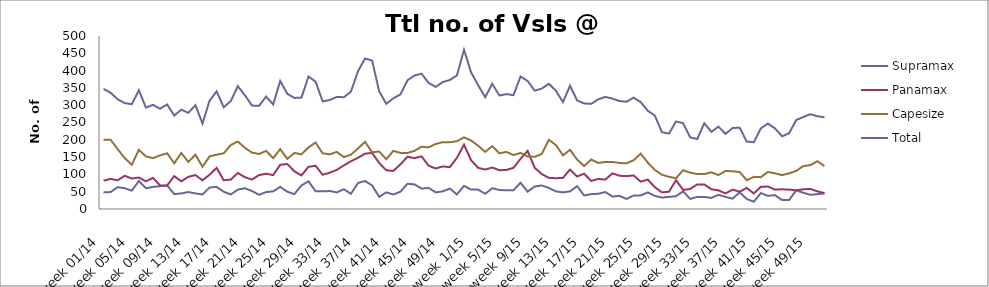
| Category | Supramax | Panamax | Capesize | Total |
|---|---|---|---|---|
| week 01/14 | 48 | 82 | 200 | 347 |
| week 02/14 | 49 | 87 | 200 | 336 |
| week 03/14 | 63 | 83 | 173 | 317 |
| week 04/14 | 60 | 96 | 147 | 306 |
| week 05/14 | 53 | 88 | 128 | 303 |
| week 06/14 | 81 | 91 | 171 | 343 |
| week 07/14 | 60 | 80 | 152 | 293 |
| week 08/14 | 64 | 90 | 147 | 301 |
| week 09/14 | 66 | 68 | 155 | 290 |
| week 10/14 | 68 | 68 | 161 | 302 |
| week 11/14 | 43 | 95 | 132 | 270 |
| week 12/14 | 45 | 80 | 162 | 287 |
| week 13/14 | 49 | 93 | 136 | 278 |
| week 14/14 | 45 | 98 | 157 | 300 |
| week 15/14 | 42 | 83 | 122 | 247 |
| week 16/14 | 62 | 99 | 152 | 313 |
| week 17/14 | 64 | 119 | 157 | 340 |
| week 18/14 | 50 | 83 | 161 | 294 |
| week 19/14 | 42 | 85 | 185 | 312 |
| week 20/14 | 56 | 104 | 195 | 355 |
| week 21/14 | 60 | 92 | 177 | 329 |
| week 22/14 | 52 | 85 | 163 | 299 |
| week 23/14 | 41 | 98 | 159 | 298 |
| week 24/14 | 49 | 102 | 168 | 325 |
| week 25/14 | 51 | 98 | 147 | 302 |
| week 26/14 | 64 | 128 | 173 | 370 |
| week 27/14 | 50 | 130 | 145 | 333 |
| week 28/14 | 43 | 109 | 162 | 321 |
| week 29/14 | 68 | 97 | 158 | 322 |
| week 30/14 | 80 | 122 | 178 | 383 |
| week 31/14 | 51 | 125 | 192 | 368 |
| week 32/14 | 51 | 99 | 161 | 311 |
| week 33/14 | 52 | 105 | 158 | 315 |
| week 34/14 | 48 | 113 | 165 | 324 |
| week 35/14 | 57 | 126 | 150 | 323 |
| week 36/14 | 44 | 138 | 157 | 339 |
| week 37/14 | 75 | 148 | 175 | 398 |
| week 38/14 | 81 | 160 | 194 | 435 |
| week 39/14 | 68 | 162 | 164 | 429 |
| week 40/14 | 35 | 133 | 166 | 340 |
| week 41/14 | 48 | 112 | 144 | 304 |
| week 42/14 | 42 | 110 | 168 | 320 |
| week 43/14 | 50 | 129 | 162 | 331 |
| week 44/14 | 73 | 151 | 162 | 372 |
| week 45/14 | 71 | 147 | 168 | 386 |
| week 46/14 | 59 | 152 | 180 | 391 |
| week 47/14 | 61 | 125 | 178 | 364 |
| week 48/14 | 48 | 117 | 188 | 353 |
| week 49/14 | 51 | 123 | 193 | 367 |
| week 50/14 | 59 | 121 | 193 | 373 |
| week 51/14 | 42 | 148 | 196 | 386 |
| week 52/14 | 67 | 186 | 207 | 460 |
| week 1/15 | 56 | 141 | 198 | 395 |
| week 2/15 | 56 | 119 | 183 | 358 |
| week 3/15 | 44 | 114 | 165 | 323 |
| week 4/15 | 60 | 120 | 182 | 362 |
| week 5/15 | 55 | 112 | 161 | 328 |
| week 6/15 | 54 | 113 | 165 | 332 |
| week 7/15 | 54 | 119 | 156 | 329 |
| week 8/15 | 76 | 145 | 162 | 383 |
| week 9/15 | 50 | 168 | 152 | 370 |
| week 10/15 | 65 | 119 | 151 | 342 |
| week 11/15 | 68 | 101 | 159 | 348 |
| week 12/15 | 61 | 90 | 200 | 362 |
| week 13/15 | 51 | 89 | 185 | 342 |
| week 14/15 | 48 | 90 | 155 | 309 |
| week 15/15 | 51 | 114 | 171 | 356 |
| week 16/15 | 66 | 94 | 143 | 314 |
| week 17/15 | 39 | 102 | 124 | 305 |
| week 18/15 | 43 | 81 | 143 | 304 |
| week 19/15 | 44 | 87 | 133 | 317 |
| week 20/15 | 49 | 85 | 136 | 324 |
| week 21/15 | 36 | 103 | 136 | 319 |
| week 22/15 | 38 | 96 | 133 | 312 |
| week 23/15 | 29 | 95 | 132 | 310 |
| week 24/15 | 39 | 97 | 141 | 322 |
| week 25/15 | 39 | 79 | 160 | 309 |
| week 26/15 | 48 | 85 | 134 | 284 |
| week 27/15 | 38 | 63 | 113 | 270 |
| week 28/15 | 33 | 48 | 99 | 222 |
| week 29/15 | 35 | 50 | 93 | 218 |
| week 30/15 | 37 | 83 | 89 | 253 |
| week 31/15 | 51 | 55 | 112 | 248 |
| week 32/15 | 29 | 58 | 105 | 207 |
| week 33/15 | 35 | 71 | 101 | 202 |
| week 34/15 | 35 | 71 | 101 | 248 |
| week 35/15 | 32 | 57 | 106 | 223 |
| week 36/15 | 41 | 54 | 98 | 238 |
| week 37/15 | 35 | 45 | 110 | 217 |
| week 38/15 | 30 | 56 | 109 | 234 |
| week 39/15 | 48 | 50 | 107 | 235 |
| week 40/15 | 29 | 61 | 83 | 195 |
| week 41/15 | 21 | 45 | 93 | 193 |
| week 42/15 | 46 | 64 | 92 | 233 |
| week 43/15 | 38 | 65 | 107 | 247 |
| week 44/15 | 40 | 56 | 103 | 233 |
| week 45/15 | 26 | 57 | 98 | 210 |
| week 46/15 | 26 | 56 | 103 | 219 |
| week 47/15 | 54 | 54 | 110 | 257 |
| week 48/15 | 47 | 57 | 124 | 266 |
| week 49/15 | 41 | 58 | 127 | 274 |
| week 50/15 | 43 | 51 | 138 | 268 |